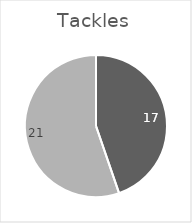
| Category | Tackles |
|---|---|
| Liverpool | 17 |
| Manchester United | 21 |